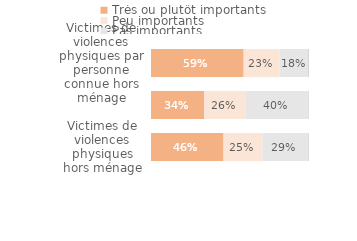
| Category | Très ou plutôt importants | Peu importants | Pas importants | Ne sait pas/Refus |
|---|---|---|---|---|
| Victimes de violences physiques hors ménage | 0.459 | 0.245 | 0.291 | 0.004 |
| Victimes de violences physiques par inconnu | 0.338 | 0.263 | 0.396 | 0.003 |
| Victimes de violences physiques par personne connue hors ménage | 0.586 | 0.227 | 0.181 | 0.005 |